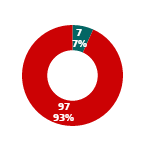
| Category | Series 10 |
|---|---|
| Count Complete | 7 |
| Count Not Complete | 97 |